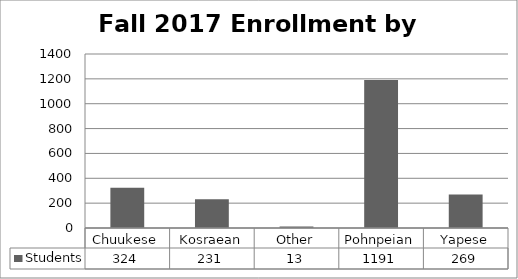
| Category | Students |
|---|---|
| Chuukese | 324 |
| Kosraean | 231 |
| Other | 13 |
| Pohnpeian | 1191 |
| Yapese | 269 |